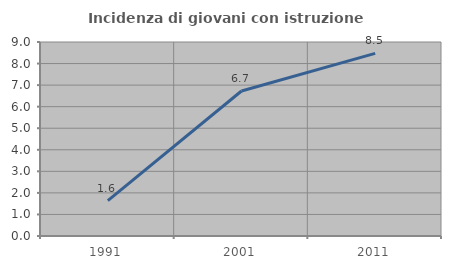
| Category | Incidenza di giovani con istruzione universitaria |
|---|---|
| 1991.0 | 1.639 |
| 2001.0 | 6.726 |
| 2011.0 | 8.475 |